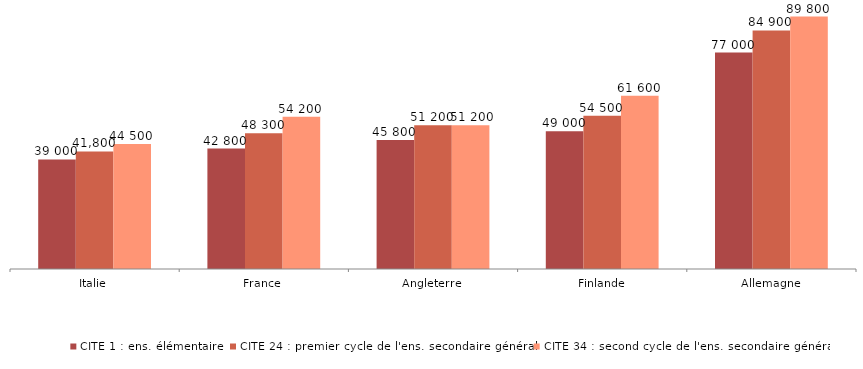
| Category | CITE 1 : ens. élémentaire | CITE 24 : premier cycle de l'ens. secondaire général | CITE 34 : second cycle de l'ens. secondaire général |
|---|---|---|---|
| Italie | 38977.836 | 41800.042 | 44464.005 |
| France | 42837.197 | 48310.493 | 54186.466 |
| Angleterre | 45849.419 | 51164.334 | 51164.334 |
| Finlande | 49025.305 | 54541.342 | 61609.272 |
| Allemagne | 76997.215 | 84869.383 | 89816.124 |